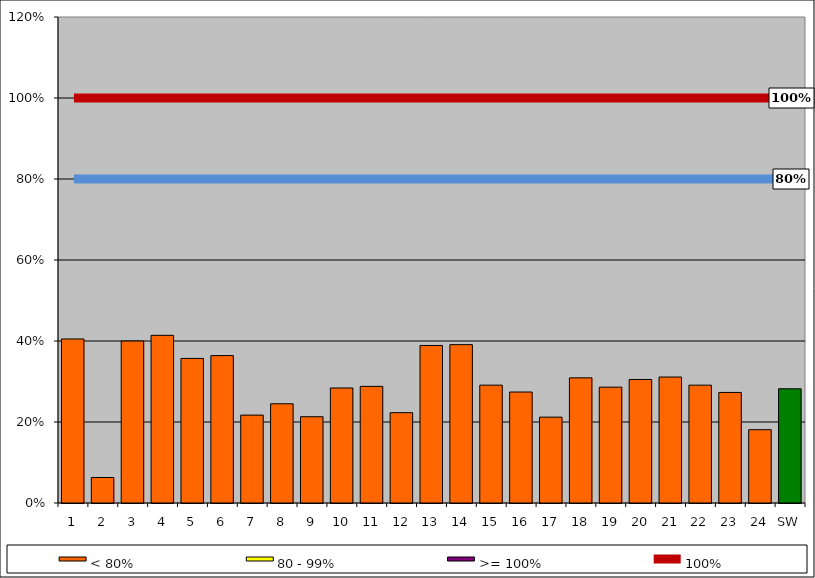
| Category | < 80% | 80 - 99% | >= 100% |
|---|---|---|---|
| 1 | 0.405 | 0 | 0 |
| 2 | 0.063 | 0 | 0 |
| 3 | 0.4 | 0 | 0 |
| 4 | 0.414 | 0 | 0 |
| 5 | 0.357 | 0 | 0 |
| 6 | 0.364 | 0 | 0 |
| 7 | 0.217 | 0 | 0 |
| 8 | 0.245 | 0 | 0 |
| 9 | 0.213 | 0 | 0 |
| 10 | 0.284 | 0 | 0 |
| 11 | 0.288 | 0 | 0 |
| 12 | 0.223 | 0 | 0 |
| 13 | 0.389 | 0 | 0 |
| 14 | 0.391 | 0 | 0 |
| 15 | 0.291 | 0 | 0 |
| 16 | 0.274 | 0 | 0 |
| 17 | 0.212 | 0 | 0 |
| 18 | 0.309 | 0 | 0 |
| 19 | 0.286 | 0 | 0 |
| 20 | 0.305 | 0 | 0 |
| 21 | 0.311 | 0 | 0 |
| 22 | 0.291 | 0 | 0 |
| 23 | 0.273 | 0 | 0 |
| 24 | 0.181 | 0 | 0 |
| SW | 0.282 | 0 | 0 |